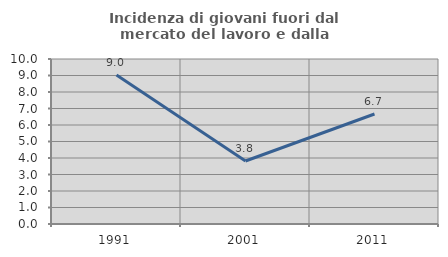
| Category | Incidenza di giovani fuori dal mercato del lavoro e dalla formazione  |
|---|---|
| 1991.0 | 9.028 |
| 2001.0 | 3.817 |
| 2011.0 | 6.667 |